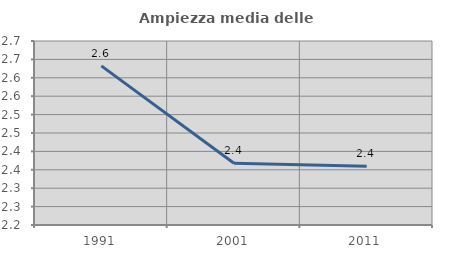
| Category | Ampiezza media delle famiglie |
|---|---|
| 1991.0 | 2.632 |
| 2001.0 | 2.368 |
| 2011.0 | 2.359 |